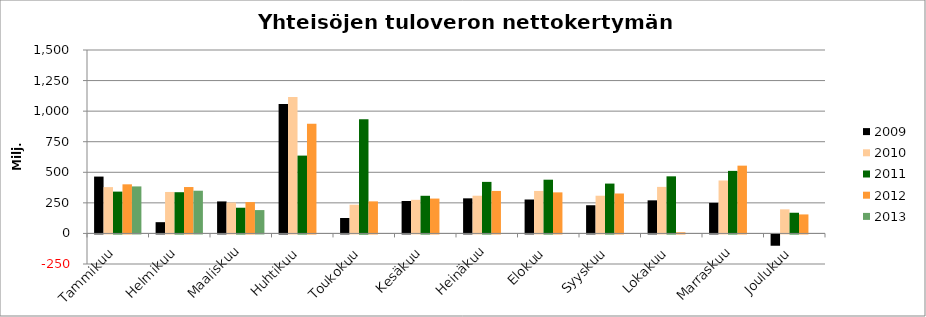
| Category | 2009 | 2010 | 2011 | 2012 | 2013 |
|---|---|---|---|---|---|
| Tammikuu | 464.899 | 378.86 | 341.987 | 401.627 | 384.485 |
| Helmikuu | 92.021 | 339.045 | 337.078 | 379.401 | 349.199 |
| Maaliskuu | 261.783 | 253.057 | 210.203 | 256.28 | 190.945 |
| Huhtikuu | 1059.201 | 1115.624 | 636.437 | 897.203 | 0 |
| Toukokuu | 126.163 | 234.756 | 933.434 | 262.244 | 0 |
| Kesäkuu | 265.105 | 274.88 | 307.856 | 285.13 | 0 |
| Heinäkuu | 286.978 | 308.391 | 421.522 | 347.389 | 0 |
| Elokuu | 277.363 | 347.548 | 439.399 | 335.795 | 0 |
| Syyskuu | 230.468 | 308.333 | 407.65 | 326.578 | 0 |
| Lokakuu | 270.56 | 380.508 | 466.894 | 9.04 | 0 |
| Marraskuu | 249.968 | 432.891 | 511.438 | 554.296 | 0 |
| Joulukuu | -92.536 | 196.924 | 169.141 | 155.44 | 0 |